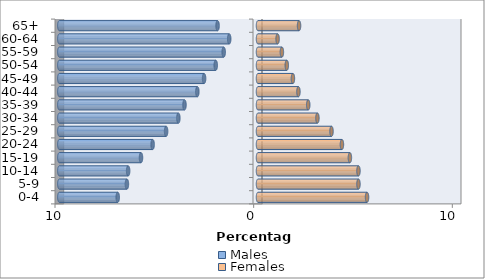
| Category | Males | Females |
|---|---|---|
| 0-4 | -7.061 | 5.489 |
| 5-9 | -6.599 | 5.057 |
| 10-14 | -6.537 | 5.057 |
| 15-19 | -5.89 | 4.625 |
| 20-24 | -5.304 | 4.224 |
| 25-29 | -4.625 | 3.7 |
| 30-34 | -4.009 | 2.991 |
| 35-39 | -3.7 | 2.529 |
| 40-44 | -3.053 | 2.035 |
| 45-49 | -2.714 | 1.758 |
| 50-54 | -2.128 | 1.449 |
| 55-59 | -1.727 | 1.203 |
| 60-64 | -1.449 | 0.987 |
| 65+ | -2.035 | 2.066 |